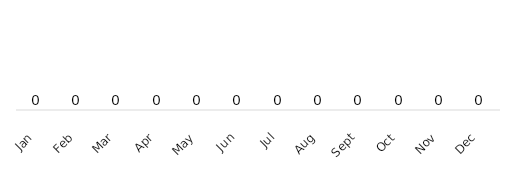
| Category | Series 0 |
|---|---|
| 2019-01-01 | 0 |
| 2019-02-01 | 0 |
| 2019-03-01 | 0 |
| 2019-04-01 | 0 |
| 2019-05-01 | 0 |
| 2019-06-01 | 0 |
| 2019-07-01 | 0 |
| 2019-08-01 | 0 |
| 2019-09-01 | 0 |
| 2019-10-01 | 0 |
| 2019-11-01 | 0 |
| 2019-12-01 | 0 |